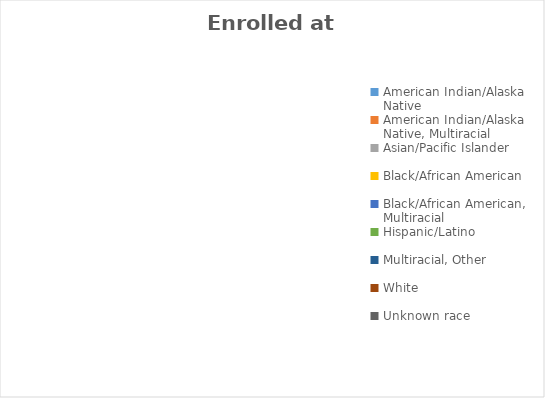
| Category | Enrolled at start | Referred | Screened | Accepted | Successful Outcome | Unsuccessful Outcome | Reunified with child(ren) | Enrolled at end of period |
|---|---|---|---|---|---|---|---|---|
| American Indian/Alaska Native  | 0 | 0 | 0 | 0 | 0 | 0 | 0 | 0 |
| American Indian/Alaska Native, Multiracial | 0 | 0 | 0 | 0 | 0 | 0 | 0 | 0 |
| Asian/Pacific Islander | 0 | 0 | 0 | 0 | 0 | 0 | 0 | 0 |
| Black/African American | 0 | 0 | 0 | 0 | 0 | 0 | 0 | 0 |
| Black/African American, Multiracial | 0 | 0 | 0 | 0 | 0 | 0 | 0 | 0 |
| Hispanic/Latino  | 0 | 0 | 0 | 0 | 0 | 0 | 0 | 0 |
| Multiracial, Other | 0 | 0 | 0 | 0 | 0 | 0 | 0 | 0 |
| White  | 0 | 0 | 0 | 0 | 0 | 0 | 0 | 0 |
| Unknown race | 0 | 0 | 0 | 0 | 0 | 0 | 0 | 0 |